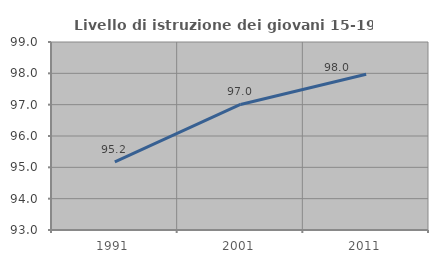
| Category | Livello di istruzione dei giovani 15-19 anni |
|---|---|
| 1991.0 | 95.175 |
| 2001.0 | 97.006 |
| 2011.0 | 97.973 |